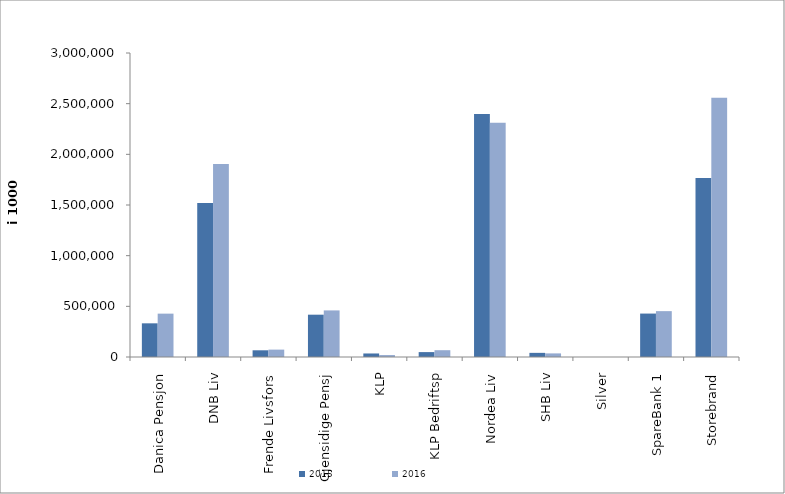
| Category | 2015 | 2016 |
|---|---|---|
| 0 | 332316.511 | 427878.547 |
| 1 | 1519935 | 1903608 |
| 2 | 66204 | 72809 |
| 3 | 417565.04 | 459736.743 |
| 4 | 34798.179 | 19254.72 |
| 5 | 48368 | 67086 |
| 6 | 2397593.309 | 2311573.67 |
| 7 | 40835 | 35581 |
| 8 | 14.588 | 0.181 |
| 9 | 428603.115 | 452574.882 |
| 10 | 1766336.733 | 2557556.949 |